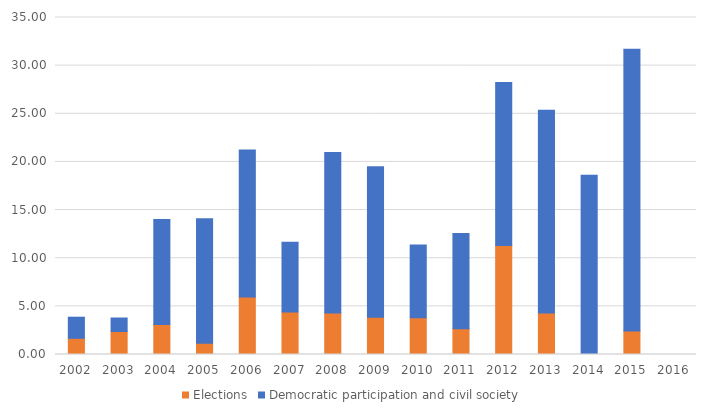
| Category | Elections | Democratic participation and civil society |
|---|---|---|
| 2002.0 | 1.682 | 2.192 |
| 2003.0 | 2.386 | 1.405 |
| 2004.0 | 3.127 | 10.899 |
| 2005.0 | 1.172 | 12.925 |
| 2006.0 | 5.977 | 15.268 |
| 2007.0 | 4.417 | 7.252 |
| 2008.0 | 4.318 | 16.663 |
| 2009.0 | 3.868 | 15.639 |
| 2010.0 | 3.817 | 7.556 |
| 2011.0 | 2.683 | 9.874 |
| 2012.0 | 11.324 | 16.935 |
| 2013.0 | 4.31 | 21.061 |
| 2014.0 | 0 | 18.604 |
| 2015.0 | 2.439 | 29.255 |
| 2016.0 | 0 | 0 |